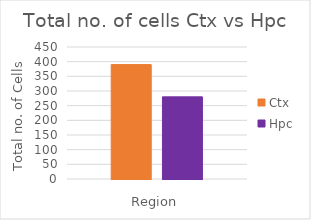
| Category | Ctx | Hpc |
|---|---|---|
| Total cells | 390 | 280 |